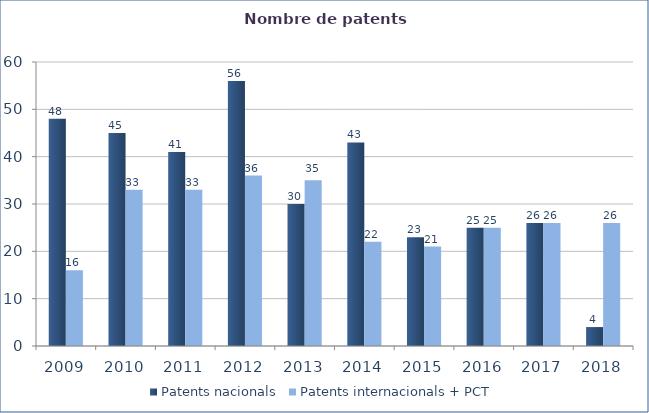
| Category | Patents nacionals | Patents internacionals + PCT |
|---|---|---|
| 2009.0 | 48 | 16 |
| 2010.0 | 45 | 33 |
| 2011.0 | 41 | 33 |
| 2012.0 | 56 | 36 |
| 2013.0 | 30 | 35 |
| 2014.0 | 43 | 22 |
| 2015.0 | 23 | 21 |
| 2016.0 | 25 | 25 |
| 2017.0 | 26 | 26 |
| 2018.0 | 4 | 26 |